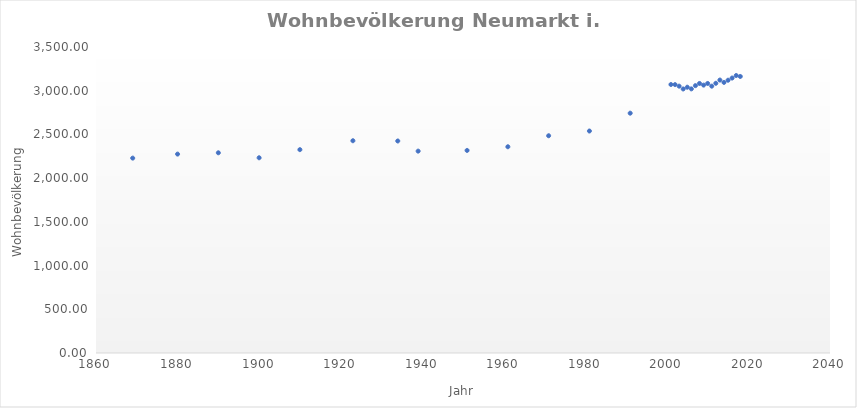
| Category | 3.163,00 |
|---|---|
| 2018.0 | 3163 |
| 2017.0 | 3174 |
| 2016.0 | 3145 |
| 2015.0 | 3120 |
| 2014.0 | 3095 |
| 2013.0 | 3122 |
| 2012.0 | 3085 |
| 2011.0 | 3052 |
| 2010.0 | 3083 |
| 2009.0 | 3064 |
| 2008.0 | 3083 |
| 2007.0 | 3058 |
| 2006.0 | 3021 |
| 2005.0 | 3040 |
| 2004.0 | 3020 |
| 2003.0 | 3052 |
| 2002.0 | 3070 |
| 2001.0 | 3071 |
| 1991.0 | 2743 |
| 1981.0 | 2539 |
| 1971.0 | 2485 |
| 1961.0 | 2359 |
| 1951.0 | 2317 |
| 1939.0 | 2309 |
| 1934.0 | 2425 |
| 1923.0 | 2428 |
| 1910.0 | 2326 |
| 1900.0 | 2233 |
| 1890.0 | 2290 |
| 1880.0 | 2275 |
| 1869.0 | 2229 |